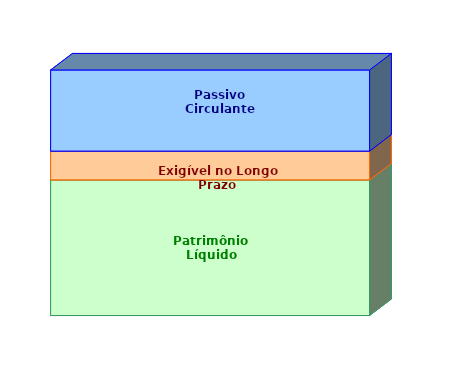
| Category | Patrimônio Líquido | Exigível no Longo Prazo | Passivo Circulante |
|---|---|---|---|
| 0 | 0.552 | 0.117 | 0.33 |